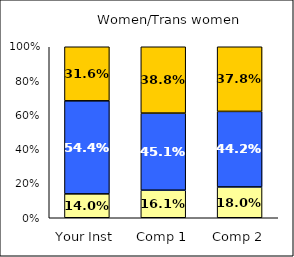
| Category | Low Career Related Stress | Average Career Related Stress | High Career Related Stress |
|---|---|---|---|
| Your Inst | 0.14 | 0.544 | 0.316 |
| Comp 1 | 0.161 | 0.451 | 0.388 |
| Comp 2 | 0.18 | 0.442 | 0.378 |